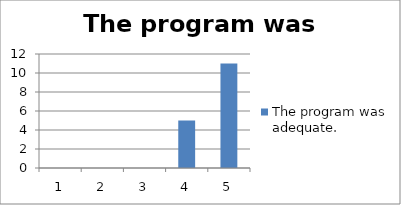
| Category | The program was adequate. |
|---|---|
| 0 | 0 |
| 1 | 0 |
| 2 | 0 |
| 3 | 5 |
| 4 | 11 |